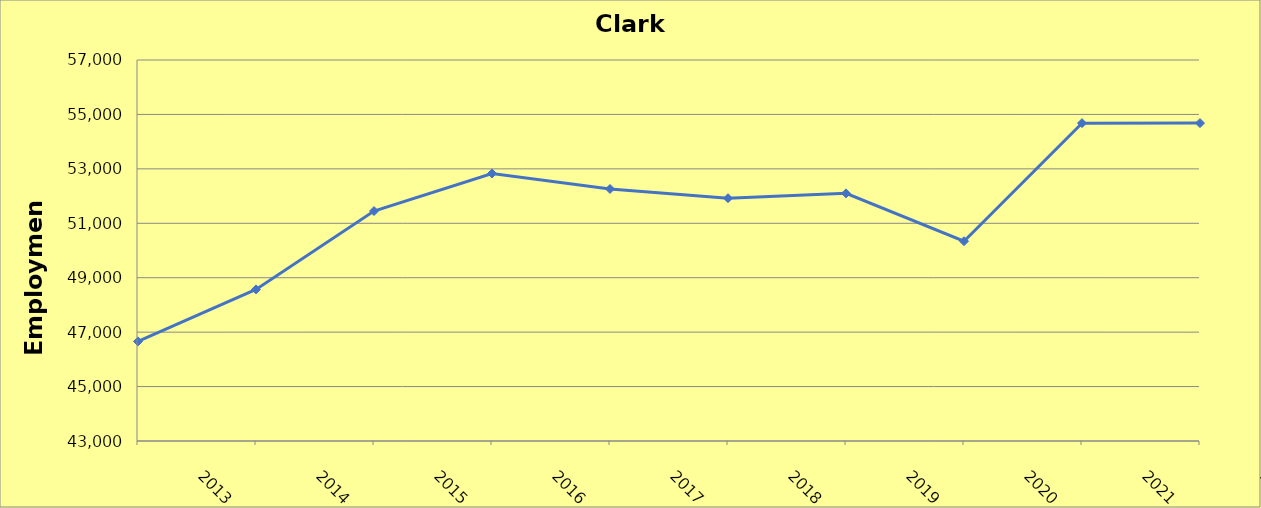
| Category | Clark County |
|---|---|
| 2013.0 | 46660 |
| 2014.0 | 48570 |
| 2015.0 | 51450 |
| 2016.0 | 52830 |
| 2017.0 | 52260 |
| 2018.0 | 51920 |
| 2019.0 | 52100 |
| 2020.0 | 50340 |
| 2021.0 | 54680 |
| 2022.0 | 54682 |